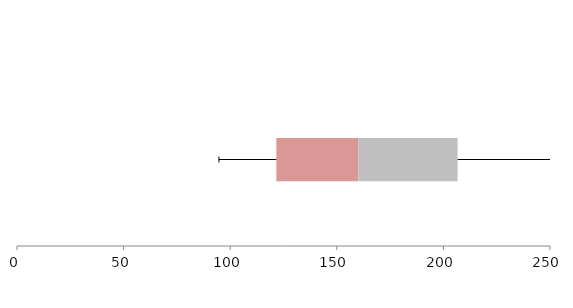
| Category | Series 1 | Series 2 | Series 3 |
|---|---|---|---|
| 0 | 121.65 | 38.471 | 46.562 |